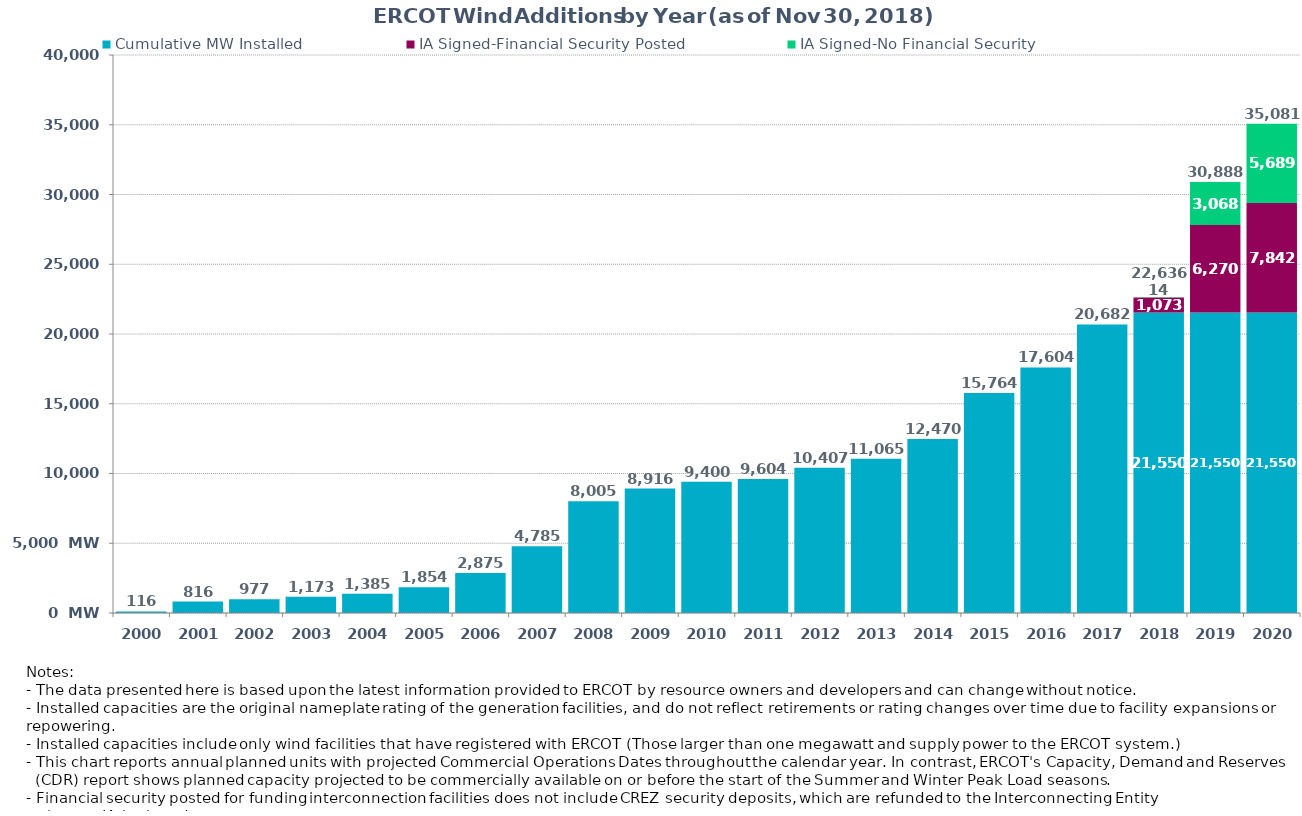
| Category | Cumulative MW Installed | IA Signed-Financial Security Posted  | IA Signed-No Financial Security  | Cumulative Installed and Planned |
|---|---|---|---|---|
| 2000.0 | 116 | 0 | 0 | 116 |
| 2001.0 | 816 | 0 | 0 | 816 |
| 2002.0 | 977 | 0 | 0 | 977 |
| 2003.0 | 1173 | 0 | 0 | 1173 |
| 2004.0 | 1385 | 0 | 0 | 1385 |
| 2005.0 | 1854 | 0 | 0 | 1854 |
| 2006.0 | 2875 | 0 | 0 | 2875 |
| 2007.0 | 4785 | 0 | 0 | 4785 |
| 2008.0 | 8005 | 0 | 0 | 8005 |
| 2009.0 | 8916 | 0 | 0 | 8916 |
| 2010.0 | 9400 | 0 | 0 | 9400 |
| 2011.0 | 9604 | 0 | 0 | 9604 |
| 2012.0 | 10407 | 0 | 0 | 10407 |
| 2013.0 | 11065 | 0 | 0 | 11065 |
| 2014.0 | 12470 | 0 | 0 | 12470 |
| 2015.0 | 15764 | 0 | 0 | 15764 |
| 2016.0 | 17604 | 0 | 0 | 17604 |
| 2017.0 | 20682 | 0 | 0 | 20682 |
| 2018.0 | 21550 | 1072.5 | 13.7 | 22636.2 |
| 2019.0 | 21550 | 6269.74 | 3068 | 30887.74 |
| 2020.0 | 21550 | 7842.04 | 5688.6 | 35080.64 |